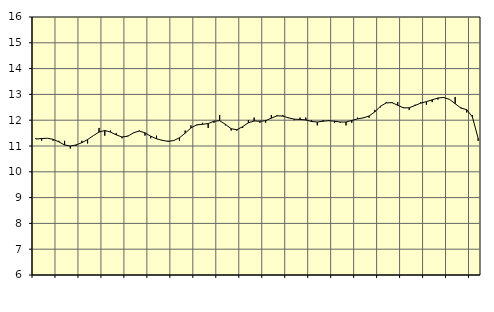
| Category | Piggar | Handel, SNI 45-47 |
|---|---|---|
| nan | 11.3 | 11.27 |
| 1.0 | 11.2 | 11.29 |
| 1.0 | 11.3 | 11.3 |
| 1.0 | 11.2 | 11.26 |
| nan | 11.2 | 11.16 |
| 2.0 | 11.2 | 11.04 |
| 2.0 | 10.9 | 11 |
| 2.0 | 11 | 11.04 |
| nan | 11.2 | 11.13 |
| 3.0 | 11.1 | 11.25 |
| 3.0 | 11.4 | 11.4 |
| 3.0 | 11.7 | 11.54 |
| nan | 11.4 | 11.6 |
| 4.0 | 11.6 | 11.54 |
| 4.0 | 11.5 | 11.43 |
| 4.0 | 11.3 | 11.35 |
| nan | 11.4 | 11.38 |
| 5.0 | 11.5 | 11.51 |
| 5.0 | 11.6 | 11.58 |
| 5.0 | 11.4 | 11.51 |
| nan | 11.3 | 11.38 |
| 6.0 | 11.4 | 11.28 |
| 6.0 | 11.2 | 11.22 |
| 6.0 | 11.2 | 11.18 |
| nan | 11.2 | 11.21 |
| 7.0 | 11.2 | 11.32 |
| 7.0 | 11.6 | 11.5 |
| 7.0 | 11.8 | 11.7 |
| nan | 11.8 | 11.82 |
| 8.0 | 11.9 | 11.84 |
| 8.0 | 11.7 | 11.87 |
| 8.0 | 11.9 | 11.96 |
| nan | 12.2 | 11.98 |
| 9.0 | 11.8 | 11.84 |
| 9.0 | 11.6 | 11.67 |
| 9.0 | 11.6 | 11.63 |
| nan | 11.7 | 11.75 |
| 10.0 | 12 | 11.9 |
| 10.0 | 12.1 | 11.97 |
| 10.0 | 11.9 | 11.96 |
| nan | 11.9 | 11.98 |
| 11.0 | 12.2 | 12.08 |
| 11.0 | 12.2 | 12.17 |
| 11.0 | 12.2 | 12.16 |
| nan | 12.1 | 12.09 |
| 12.0 | 12 | 12.04 |
| 12.0 | 12.1 | 12.03 |
| 12.0 | 12.1 | 12.01 |
| nan | 12 | 11.95 |
| 13.0 | 11.8 | 11.93 |
| 13.0 | 12 | 11.96 |
| 13.0 | 12 | 11.98 |
| nan | 11.9 | 11.96 |
| 14.0 | 11.9 | 11.93 |
| 14.0 | 11.8 | 11.93 |
| 14.0 | 11.9 | 11.99 |
| nan | 12.1 | 12.05 |
| 15.0 | 12.1 | 12.09 |
| 15.0 | 12.1 | 12.16 |
| 15.0 | 12.4 | 12.32 |
| nan | 12.5 | 12.54 |
| 16.0 | 12.7 | 12.67 |
| 16.0 | 12.7 | 12.68 |
| 16.0 | 12.7 | 12.58 |
| nan | 12.5 | 12.48 |
| 17.0 | 12.4 | 12.48 |
| 17.0 | 12.6 | 12.57 |
| 17.0 | 12.7 | 12.66 |
| nan | 12.6 | 12.72 |
| 18.0 | 12.7 | 12.79 |
| 18.0 | 12.8 | 12.86 |
| 18.0 | 12.9 | 12.88 |
| nan | 12.8 | 12.81 |
| 19.0 | 12.9 | 12.64 |
| 19.0 | 12.5 | 12.47 |
| 19.0 | 12.3 | 12.41 |
| nan | 12.2 | 12.13 |
| 20.0 | 11.2 | 11.3 |